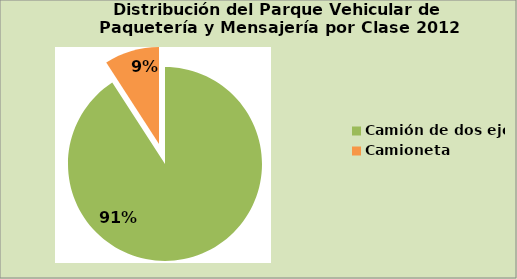
| Category | Series 0 |
|---|---|
| Camión de dos ejes | 90.85 |
| Camioneta | 9.15 |